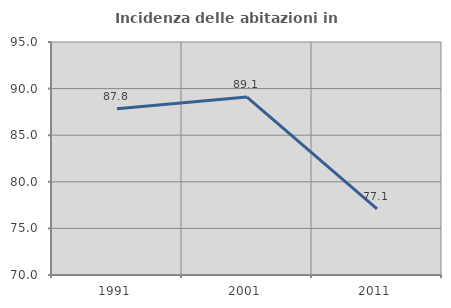
| Category | Incidenza delle abitazioni in proprietà  |
|---|---|
| 1991.0 | 87.838 |
| 2001.0 | 89.091 |
| 2011.0 | 77.083 |